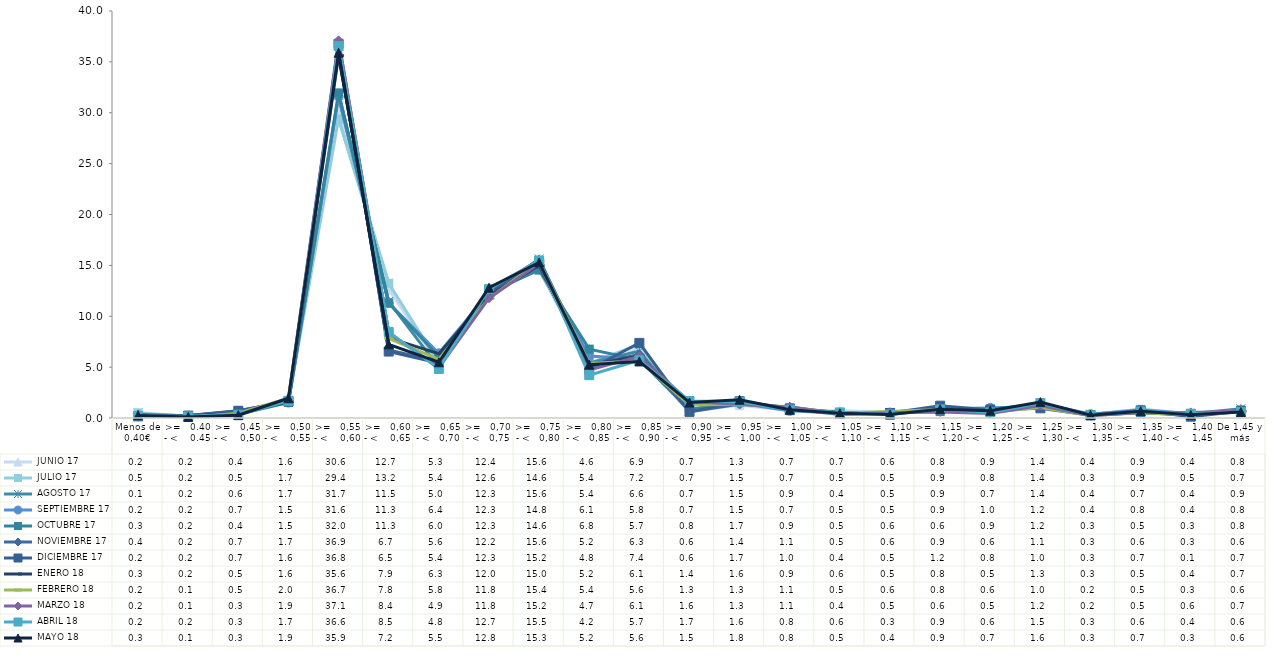
| Category |  JUNIO 17 |  JULIO 17 |  AGOSTO 17 |  SEPTIEMBRE 17 |  OCTUBRE 17 |  NOVIEMBRE 17 |  DICIEMBRE 17 |  ENERO 18 |  FEBRERO 18 |  MARZO 18 |  ABRIL 18 |  MAYO 18 |
|---|---|---|---|---|---|---|---|---|---|---|---|---|
| Menos de 0,40€ | 0.21 | 0.51 | 0.12 | 0.18 | 0.25 | 0.35 | 0.16 | 0.27 | 0.23 | 0.24 | 0.2 | 0.25 |
| >=   0.40 - <    0.45 | 0.17 | 0.18 | 0.17 | 0.21 | 0.22 | 0.21 | 0.24 | 0.17 | 0.08 | 0.1 | 0.16 | 0.11 |
| >=   0,45 - <    0,50 | 0.38 | 0.46 | 0.62 | 0.67 | 0.37 | 0.7 | 0.71 | 0.47 | 0.47 | 0.33 | 0.32 | 0.28 |
| >=   0,50 - <    0,55 | 1.6 | 1.66 | 1.67 | 1.51 | 1.53 | 1.68 | 1.63 | 1.59 | 1.95 | 1.9 | 1.69 | 1.94 |
| >=   0,55 - <    0,60 | 30.6 | 29.4 | 31.74 | 31.58 | 31.95 | 36.88 | 36.78 | 35.62 | 36.65 | 37.11 | 36.55 | 35.9 |
| >=   0,60 - <    0,65 | 12.65 | 13.24 | 11.45 | 11.29 | 11.31 | 6.69 | 6.53 | 7.87 | 7.82 | 8.37 | 8.46 | 7.24 |
| >=   0,65 - <   0,70 | 5.32 | 5.38 | 4.98 | 6.36 | 6.02 | 5.56 | 5.41 | 6.32 | 5.77 | 4.94 | 4.82 | 5.48 |
| >=   0,70 - <   0,75 | 12.39 | 12.6 | 12.26 | 12.3 | 12.29 | 12.24 | 12.31 | 12 | 11.76 | 11.77 | 12.66 | 12.8 |
| >=   0,75 - <   0,80 | 15.56 | 14.55 | 15.63 | 14.82 | 14.55 | 15.56 | 15.2 | 14.99 | 15.39 | 15.19 | 15.48 | 15.29 |
| >=   0,80 - <   0,85 | 4.63 | 5.37 | 5.41 | 6.09 | 6.77 | 5.19 | 4.77 | 5.21 | 5.36 | 4.73 | 4.21 | 5.24 |
| >=   0,85 - <   0,90 | 6.91 | 7.24 | 6.57 | 5.78 | 5.71 | 6.25 | 7.38 | 6.08 | 5.62 | 6.06 | 5.68 | 5.56 |
| >=   0,90 - <    0,95 | 0.69 | 0.72 | 0.72 | 0.74 | 0.83 | 0.6 | 0.6 | 1.37 | 1.29 | 1.62 | 1.67 | 1.52 |
| >=   0,95 - <   1,00 | 1.26 | 1.49 | 1.54 | 1.46 | 1.65 | 1.38 | 1.65 | 1.56 | 1.34 | 1.33 | 1.6 | 1.79 |
| >=   1,00 - <   1,05 | 0.73 | 0.73 | 0.89 | 0.7 | 0.87 | 1.09 | 0.95 | 0.9 | 1.06 | 1.09 | 0.82 | 0.81 |
| >=   1,05 - <    1,10 | 0.71 | 0.54 | 0.35 | 0.46 | 0.46 | 0.48 | 0.44 | 0.57 | 0.46 | 0.4 | 0.55 | 0.46 |
| >=   1,10 - <   1,15 | 0.57 | 0.52 | 0.46 | 0.49 | 0.55 | 0.56 | 0.49 | 0.51 | 0.64 | 0.52 | 0.34 | 0.35 |
| >=   1,15 - <    1,20 | 0.83 | 0.88 | 0.88 | 0.91 | 0.63 | 0.91 | 1.21 | 0.8 | 0.83 | 0.6 | 0.85 | 0.86 |
| >=   1,20 - <    1,25 | 0.85 | 0.8 | 0.68 | 0.99 | 0.91 | 0.64 | 0.79 | 0.52 | 0.57 | 0.45 | 0.55 | 0.71 |
| >=   1,25 - <    1,30 | 1.41 | 1.4 | 1.44 | 1.15 | 1.23 | 1.14 | 0.95 | 1.3 | 1.04 | 1.23 | 1.47 | 1.56 |
| >=   1,30 - <    1,35 | 0.39 | 0.31 | 0.36 | 0.38 | 0.33 | 0.34 | 0.28 | 0.3 | 0.24 | 0.21 | 0.26 | 0.28 |
| >=   1,35 - <    1,40 | 0.85 | 0.86 | 0.71 | 0.78 | 0.53 | 0.6 | 0.74 | 0.51 | 0.51 | 0.54 | 0.64 | 0.67 |
| >=   1,40 - <    1,45 | 0.4 | 0.45 | 0.41 | 0.41 | 0.25 | 0.32 | 0.13 | 0.37 | 0.32 | 0.55 | 0.42 | 0.31 |
| De 1,45 y más | 0.84 | 0.69 | 0.91 | 0.76 | 0.78 | 0.63 | 0.66 | 0.68 | 0.59 | 0.7 | 0.59 | 0.59 |